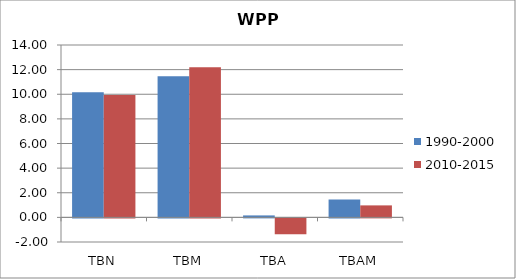
| Category | 1990-2000 | 2010-2015 |
|---|---|---|
| TBN | 10.168 | 9.93 |
| TBM | 11.46 | 12.196 |
| TBA | 0.159 | -1.292 |
| TBAM | 1.451 | 0.974 |